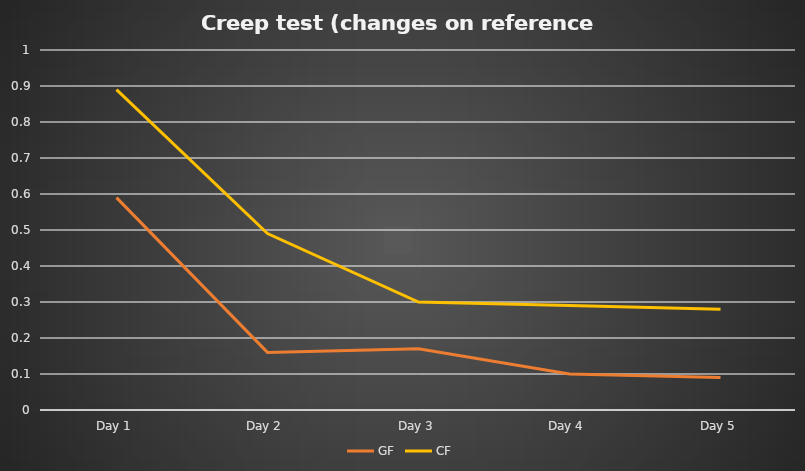
| Category | GF | CF |
|---|---|---|
| Day 1 | 0.59 | 0.89 |
| Day 2 | 0.16 | 0.49 |
| Day 3 | 0.17 | 0.3 |
| Day 4 | 0.1 | 0.29 |
| Day 5 | 0.09 | 0.28 |